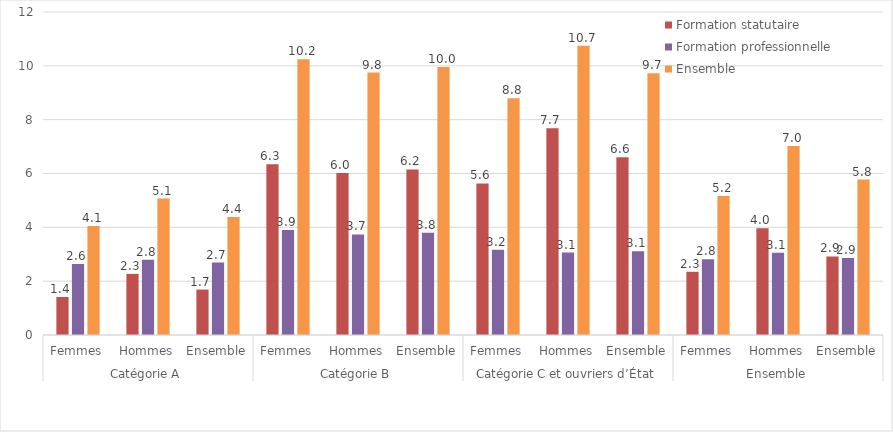
| Category | Formation statutaire | Formation professionnelle | Ensemble  |
|---|---|---|---|
| 0 | 1.412 | 2.641 | 4.052 |
| 1 | 2.271 | 2.799 | 5.07 |
| 2 | 1.689 | 2.692 | 4.381 |
| 3 | 6.345 | 3.901 | 10.245 |
| 4 | 6.017 | 3.735 | 9.752 |
| 5 | 6.151 | 3.803 | 9.954 |
| 6 | 5.633 | 3.164 | 8.795 |
| 7 | 7.685 | 3.063 | 10.747 |
| 8 | 6.608 | 3.116 | 9.723 |
| 9 | 2.349 | 2.816 | 5.165 |
| 10 | 3.964 | 3.055 | 7.019 |
| 11 | 2.918 | 2.858 | 5.776 |